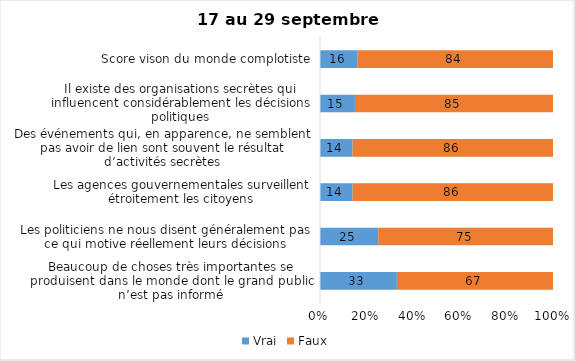
| Category | Vrai | Faux |
|---|---|---|
| Beaucoup de choses très importantes se produisent dans le monde dont le grand public n’est pas informé | 33 | 67 |
| Les politiciens ne nous disent généralement pas ce qui motive réellement leurs décisions | 25 | 75 |
| Les agences gouvernementales surveillent étroitement les citoyens | 14 | 86 |
| Des événements qui, en apparence, ne semblent pas avoir de lien sont souvent le résultat d’activités secrètes | 14 | 86 |
| Il existe des organisations secrètes qui influencent considérablement les décisions politiques | 15 | 85 |
| Score vison du monde complotiste | 16 | 84 |